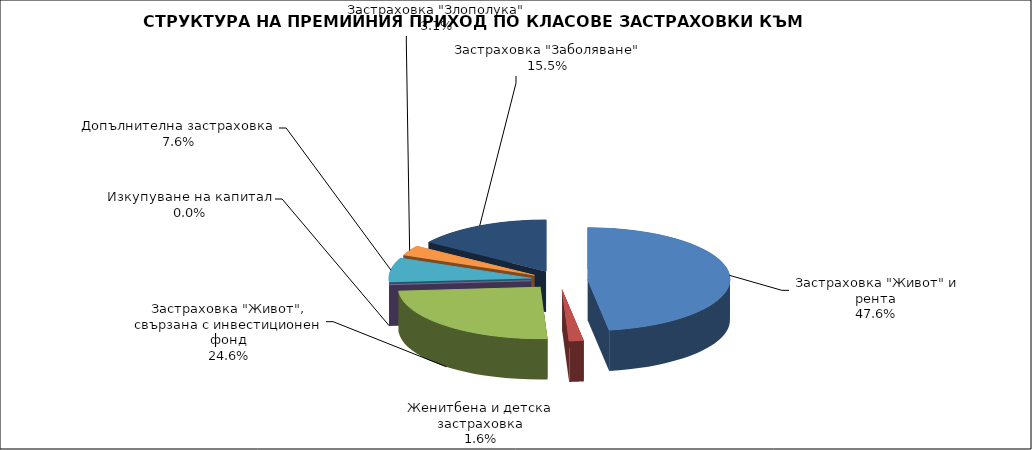
| Category |  Застраховка "Живот" и рента |
|---|---|
|  Застраховка "Живот" и рента | 210097483.315 |
| Женитбена и детска застраховка | 7221223.257 |
| Застраховка "Живот", свързана с инвестиционен фонд | 108423240.485 |
| Изкупуване на капитал | 0 |
| Допълнителна застраховка | 33721530.59 |
| Застраховка "Злополука" | 13836049.664 |
| Застраховка "Заболяване" | 68223736.541 |